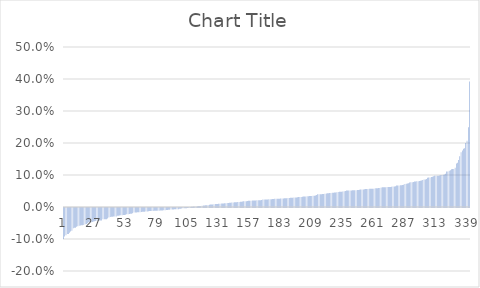
| Category | Series 0 |
|---|---|
| 0 | -0.097 |
| 1 | -0.089 |
| 2 | -0.085 |
| 3 | -0.081 |
| 4 | -0.081 |
| 5 | -0.077 |
| 6 | -0.073 |
| 7 | -0.071 |
| 8 | -0.064 |
| 9 | -0.062 |
| 10 | -0.061 |
| 11 | -0.059 |
| 12 | -0.057 |
| 13 | -0.055 |
| 14 | -0.055 |
| 15 | -0.054 |
| 16 | -0.054 |
| 17 | -0.053 |
| 18 | -0.051 |
| 19 | -0.05 |
| 20 | -0.048 |
| 21 | -0.044 |
| 22 | -0.044 |
| 23 | -0.044 |
| 24 | -0.044 |
| 25 | -0.042 |
| 26 | -0.041 |
| 27 | -0.04 |
| 28 | -0.04 |
| 29 | -0.04 |
| 30 | -0.039 |
| 31 | -0.039 |
| 32 | -0.039 |
| 33 | -0.035 |
| 34 | -0.035 |
| 35 | -0.035 |
| 36 | -0.035 |
| 37 | -0.033 |
| 38 | -0.029 |
| 39 | -0.028 |
| 40 | -0.027 |
| 41 | -0.027 |
| 42 | -0.027 |
| 43 | -0.026 |
| 44 | -0.026 |
| 45 | -0.025 |
| 46 | -0.024 |
| 47 | -0.023 |
| 48 | -0.023 |
| 49 | -0.023 |
| 50 | -0.022 |
| 51 | -0.022 |
| 52 | -0.021 |
| 53 | -0.02 |
| 54 | -0.02 |
| 55 | -0.019 |
| 56 | -0.018 |
| 57 | -0.018 |
| 58 | -0.016 |
| 59 | -0.014 |
| 60 | -0.014 |
| 61 | -0.014 |
| 62 | -0.013 |
| 63 | -0.013 |
| 64 | -0.013 |
| 65 | -0.013 |
| 66 | -0.012 |
| 67 | -0.012 |
| 68 | -0.012 |
| 69 | -0.011 |
| 70 | -0.011 |
| 71 | -0.01 |
| 72 | -0.01 |
| 73 | -0.01 |
| 74 | -0.009 |
| 75 | -0.009 |
| 76 | -0.009 |
| 77 | -0.009 |
| 78 | -0.009 |
| 79 | -0.009 |
| 80 | -0.009 |
| 81 | -0.008 |
| 82 | -0.007 |
| 83 | -0.007 |
| 84 | -0.007 |
| 85 | -0.007 |
| 86 | -0.006 |
| 87 | -0.006 |
| 88 | -0.005 |
| 89 | -0.005 |
| 90 | -0.005 |
| 91 | -0.005 |
| 92 | -0.005 |
| 93 | -0.004 |
| 94 | -0.004 |
| 95 | -0.004 |
| 96 | -0.004 |
| 97 | -0.002 |
| 98 | -0.002 |
| 99 | -0.001 |
| 100 | -0.001 |
| 101 | -0.001 |
| 102 | -0.001 |
| 103 | -0.001 |
| 104 | 0 |
| 105 | 0 |
| 106 | 0 |
| 107 | 0.001 |
| 108 | 0.001 |
| 109 | 0.001 |
| 110 | 0.002 |
| 111 | 0.002 |
| 112 | 0.003 |
| 113 | 0.003 |
| 114 | 0.003 |
| 115 | 0.003 |
| 116 | 0.004 |
| 117 | 0.004 |
| 118 | 0.005 |
| 119 | 0.005 |
| 120 | 0.006 |
| 121 | 0.006 |
| 122 | 0.007 |
| 123 | 0.008 |
| 124 | 0.008 |
| 125 | 0.008 |
| 126 | 0.009 |
| 127 | 0.009 |
| 128 | 0.009 |
| 129 | 0.01 |
| 130 | 0.01 |
| 131 | 0.01 |
| 132 | 0.011 |
| 133 | 0.011 |
| 134 | 0.011 |
| 135 | 0.011 |
| 136 | 0.012 |
| 137 | 0.012 |
| 138 | 0.013 |
| 139 | 0.013 |
| 140 | 0.013 |
| 141 | 0.014 |
| 142 | 0.014 |
| 143 | 0.015 |
| 144 | 0.015 |
| 145 | 0.015 |
| 146 | 0.016 |
| 147 | 0.016 |
| 148 | 0.017 |
| 149 | 0.017 |
| 150 | 0.017 |
| 151 | 0.018 |
| 152 | 0.018 |
| 153 | 0.018 |
| 154 | 0.019 |
| 155 | 0.02 |
| 156 | 0.02 |
| 157 | 0.02 |
| 158 | 0.02 |
| 159 | 0.02 |
| 160 | 0.021 |
| 161 | 0.021 |
| 162 | 0.021 |
| 163 | 0.021 |
| 164 | 0.021 |
| 165 | 0.021 |
| 166 | 0.022 |
| 167 | 0.023 |
| 168 | 0.023 |
| 169 | 0.024 |
| 170 | 0.024 |
| 171 | 0.024 |
| 172 | 0.024 |
| 173 | 0.024 |
| 174 | 0.024 |
| 175 | 0.025 |
| 176 | 0.025 |
| 177 | 0.025 |
| 178 | 0.025 |
| 179 | 0.026 |
| 180 | 0.026 |
| 181 | 0.026 |
| 182 | 0.026 |
| 183 | 0.026 |
| 184 | 0.027 |
| 185 | 0.027 |
| 186 | 0.028 |
| 187 | 0.028 |
| 188 | 0.028 |
| 189 | 0.028 |
| 190 | 0.029 |
| 191 | 0.029 |
| 192 | 0.029 |
| 193 | 0.029 |
| 194 | 0.03 |
| 195 | 0.03 |
| 196 | 0.03 |
| 197 | 0.031 |
| 198 | 0.031 |
| 199 | 0.031 |
| 200 | 0.032 |
| 201 | 0.033 |
| 202 | 0.033 |
| 203 | 0.033 |
| 204 | 0.033 |
| 205 | 0.033 |
| 206 | 0.034 |
| 207 | 0.034 |
| 208 | 0.034 |
| 209 | 0.035 |
| 210 | 0.035 |
| 211 | 0.036 |
| 212 | 0.038 |
| 213 | 0.04 |
| 214 | 0.04 |
| 215 | 0.04 |
| 216 | 0.04 |
| 217 | 0.04 |
| 218 | 0.041 |
| 219 | 0.042 |
| 220 | 0.042 |
| 221 | 0.043 |
| 222 | 0.043 |
| 223 | 0.044 |
| 224 | 0.044 |
| 225 | 0.044 |
| 226 | 0.045 |
| 227 | 0.045 |
| 228 | 0.045 |
| 229 | 0.046 |
| 230 | 0.047 |
| 231 | 0.047 |
| 232 | 0.048 |
| 233 | 0.048 |
| 234 | 0.048 |
| 235 | 0.049 |
| 236 | 0.05 |
| 237 | 0.051 |
| 238 | 0.052 |
| 239 | 0.052 |
| 240 | 0.052 |
| 241 | 0.052 |
| 242 | 0.052 |
| 243 | 0.052 |
| 244 | 0.053 |
| 245 | 0.053 |
| 246 | 0.053 |
| 247 | 0.053 |
| 248 | 0.054 |
| 249 | 0.054 |
| 250 | 0.055 |
| 251 | 0.055 |
| 252 | 0.056 |
| 253 | 0.056 |
| 254 | 0.056 |
| 255 | 0.056 |
| 256 | 0.057 |
| 257 | 0.057 |
| 258 | 0.057 |
| 259 | 0.057 |
| 260 | 0.057 |
| 261 | 0.059 |
| 262 | 0.059 |
| 263 | 0.059 |
| 264 | 0.059 |
| 265 | 0.06 |
| 266 | 0.061 |
| 267 | 0.061 |
| 268 | 0.061 |
| 269 | 0.062 |
| 270 | 0.062 |
| 271 | 0.062 |
| 272 | 0.062 |
| 273 | 0.062 |
| 274 | 0.063 |
| 275 | 0.063 |
| 276 | 0.064 |
| 277 | 0.064 |
| 278 | 0.065 |
| 279 | 0.067 |
| 280 | 0.067 |
| 281 | 0.067 |
| 282 | 0.068 |
| 283 | 0.068 |
| 284 | 0.069 |
| 285 | 0.07 |
| 286 | 0.072 |
| 287 | 0.072 |
| 288 | 0.073 |
| 289 | 0.074 |
| 290 | 0.076 |
| 291 | 0.078 |
| 292 | 0.078 |
| 293 | 0.078 |
| 294 | 0.08 |
| 295 | 0.08 |
| 296 | 0.08 |
| 297 | 0.081 |
| 298 | 0.081 |
| 299 | 0.082 |
| 300 | 0.082 |
| 301 | 0.084 |
| 302 | 0.086 |
| 303 | 0.086 |
| 304 | 0.088 |
| 305 | 0.092 |
| 306 | 0.092 |
| 307 | 0.092 |
| 308 | 0.094 |
| 309 | 0.094 |
| 310 | 0.096 |
| 311 | 0.097 |
| 312 | 0.098 |
| 313 | 0.098 |
| 314 | 0.098 |
| 315 | 0.098 |
| 316 | 0.099 |
| 317 | 0.1 |
| 318 | 0.101 |
| 319 | 0.102 |
| 320 | 0.104 |
| 321 | 0.111 |
| 322 | 0.111 |
| 323 | 0.113 |
| 324 | 0.115 |
| 325 | 0.118 |
| 326 | 0.119 |
| 327 | 0.119 |
| 328 | 0.123 |
| 329 | 0.136 |
| 330 | 0.138 |
| 331 | 0.147 |
| 332 | 0.158 |
| 333 | 0.171 |
| 334 | 0.176 |
| 335 | 0.182 |
| 336 | 0.184 |
| 337 | 0.2 |
| 338 | 0.207 |
| 339 | 0.249 |
| 340 | 0.392 |